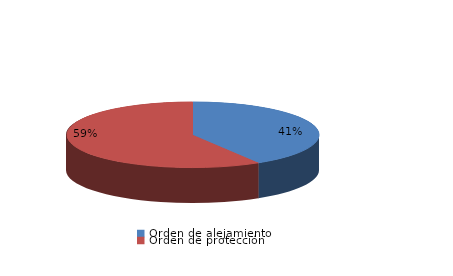
| Category | Series 0 |
|---|---|
| Orden de alejamiento | 90 |
| Orden de protección | 128 |